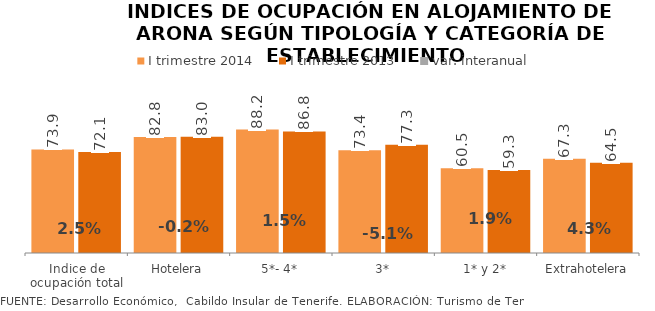
| Category | I trimestre 2014 | I trimestre 2013 |
|---|---|---|
| Indice de ocupación total | 73.938 | 72.147 |
| Hotelera | 82.826 | 83.012 |
| 5*- 4* | 88.157 | 86.83 |
| 3* | 73.374 | 77.305 |
| 1* y 2* | 60.478 | 59.344 |
| Extrahotelera | 67.257 | 64.484 |